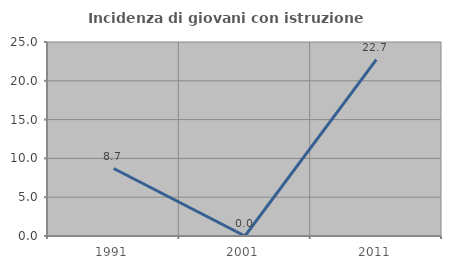
| Category | Incidenza di giovani con istruzione universitaria |
|---|---|
| 1991.0 | 8.696 |
| 2001.0 | 0 |
| 2011.0 | 22.727 |